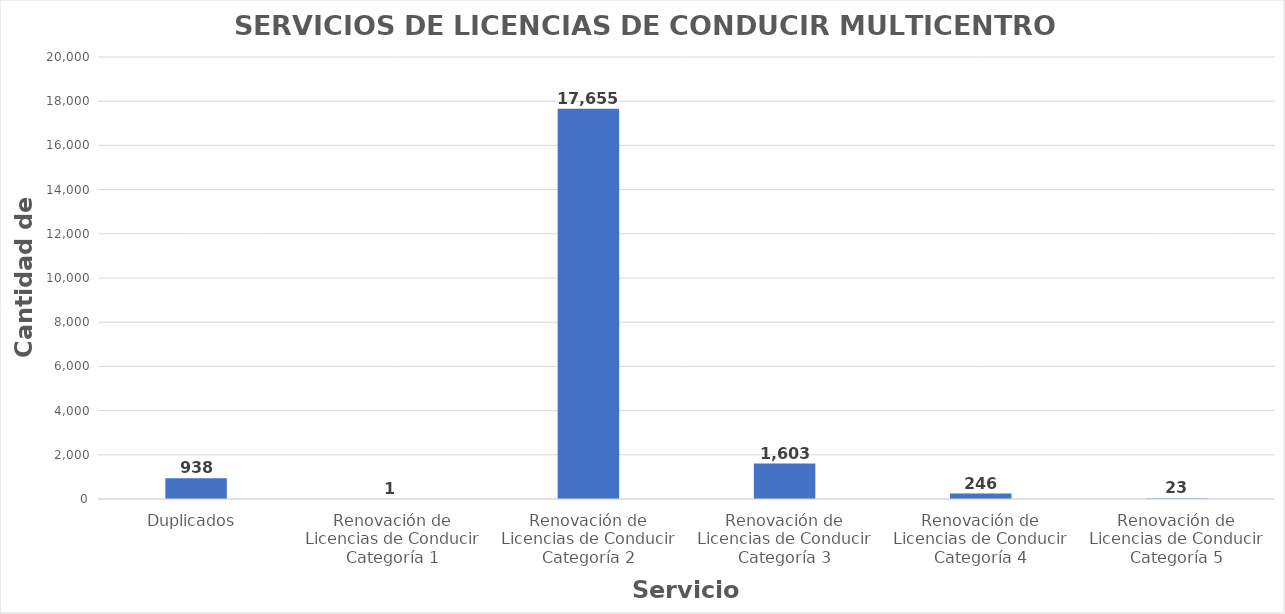
| Category | Series 0 |
|---|---|
| Duplicados  | 938 |
| Renovación de Licencias de Conducir Categoría 1 | 1 |
| Renovación de Licencias de Conducir Categoría 2 | 17655 |
| Renovación de Licencias de Conducir Categoría 3 | 1603 |
| Renovación de Licencias de Conducir Categoría 4 | 246 |
| Renovación de Licencias de Conducir Categoría 5 | 23 |